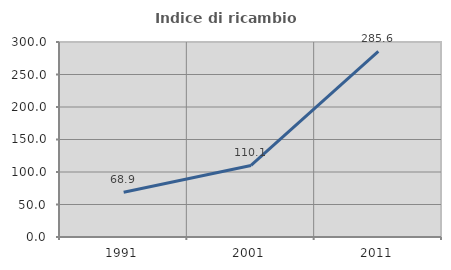
| Category | Indice di ricambio occupazionale  |
|---|---|
| 1991.0 | 68.889 |
| 2001.0 | 110.098 |
| 2011.0 | 285.635 |